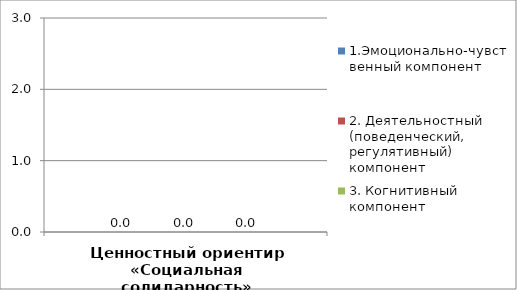
| Category | 1.Эмоционально-чувственный компонент | 2. Деятельностный (поведенческий, регулятивный) компонент | 3. Когнитивный компонент |
|---|---|---|---|
| Ценностный ориентир «Социальная солидарность» | 0 | 0 | 0 |